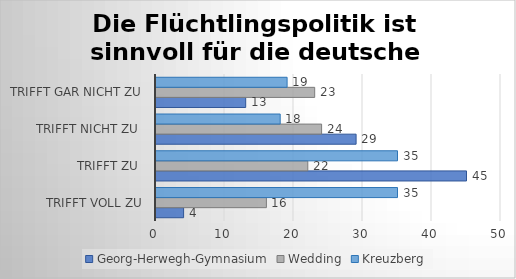
| Category | Georg-Herwegh-Gymnasium | Wedding | Kreuzberg |
|---|---|---|---|
| trifft voll zu | 4 | 16 | 35 |
| trifft zu  | 45 | 22 | 35 |
| trifft nicht zu  | 29 | 24 | 18 |
| trifft gar nicht zu | 13 | 23 | 19 |